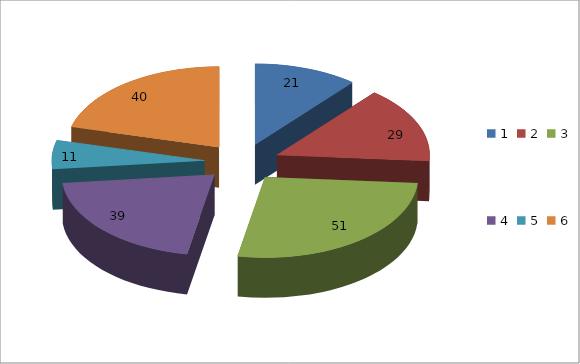
| Category | Series 0 |
|---|---|
| 0 | 21 |
| 1 | 29 |
| 2 | 51 |
| 3 | 39 |
| 4 | 11 |
| 5 | 40 |